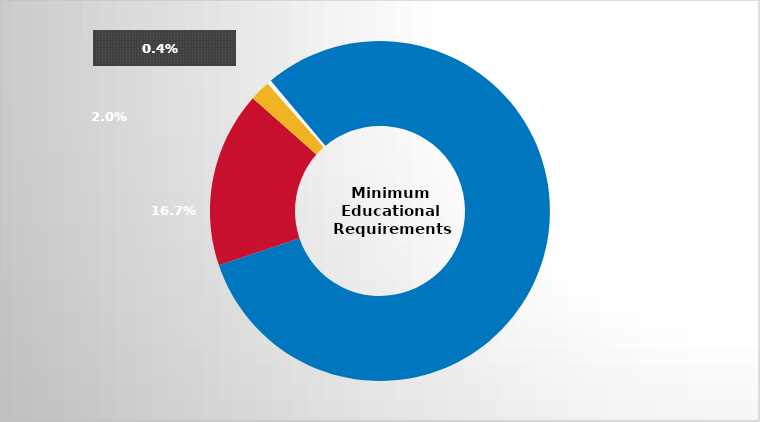
| Category | Series 0 |
|---|---|
| GED/High school diploma | 0.809 |
| Less than 1 year of college | 0.167 |
| 1 year of college | 0.02 |
| Other | 0.004 |